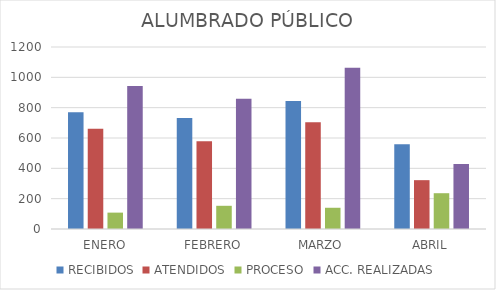
| Category | RECIBIDOS | ATENDIDOS | PROCESO | ACC. REALIZADAS |
|---|---|---|---|---|
| ENERO | 769 | 661 | 108 | 943 |
| FEBRERO | 732 | 579 | 153 | 858 |
| MARZO | 844 | 704 | 140 | 1064 |
| ABRIL | 558 | 322 | 236 | 429 |